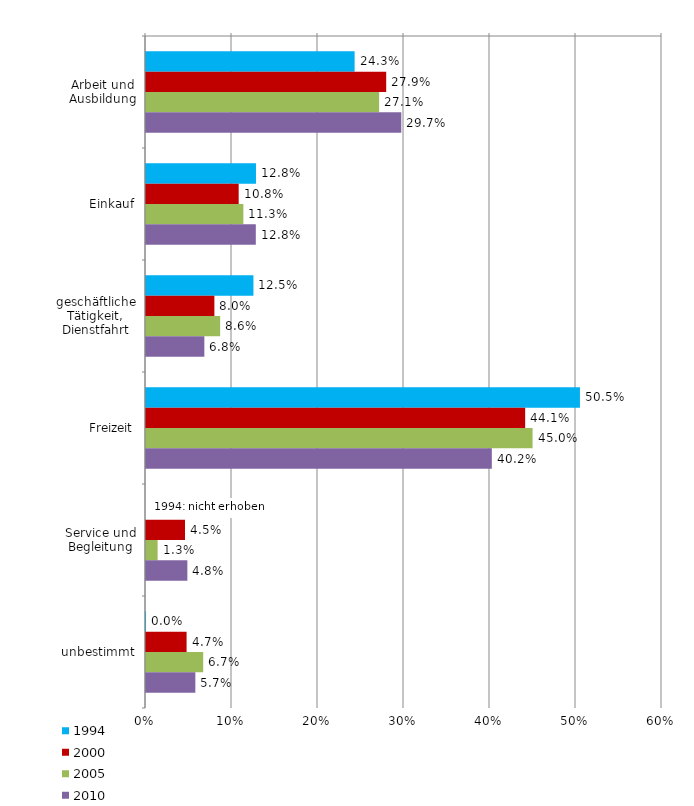
| Category | 1994 | 2000 | 2005 | 2010 |
|---|---|---|---|---|
| Arbeit und Ausbildung | 24.258 | 27.93 | 27.107 | 29.686 |
| Einkauf | 12.788 | 10.776 | 11.321 | 12.769 |
| geschäftliche Tätigkeit, Dienstfahrt | 12.492 | 7.951 | 8.621 | 6.785 |
| Freizeit | 50.458 | 44.088 | 44.951 | 40.213 |
| Service und Begleitung | 0 | 4.535 | 1.349 | 4.81 |
| unbestimmt | 0.004 | 4.72 | 6.651 | 5.738 |